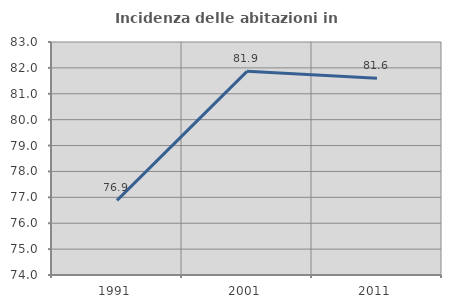
| Category | Incidenza delle abitazioni in proprietà  |
|---|---|
| 1991.0 | 76.885 |
| 2001.0 | 81.868 |
| 2011.0 | 81.603 |